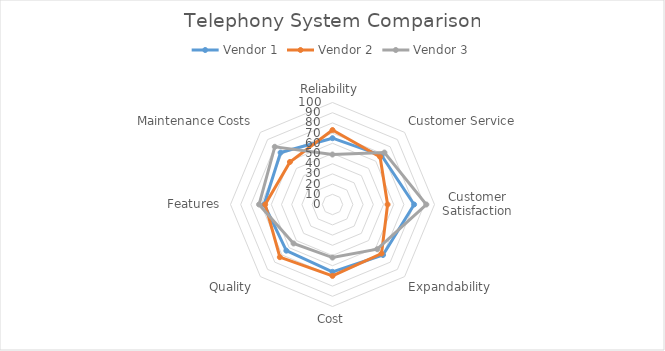
| Category | Vendor 1 | Vendor 2 | Vendor 3 |
|---|---|---|---|
| Reliability | 65 | 73 | 49 |
| Customer Service | 68 | 66 | 72 |
| Customer Satisfaction | 80 | 54 | 92 |
| Expandability | 70 | 68 | 62 |
| Cost | 66 | 70 | 52 |
| Quality | 64 | 73 | 54 |
| Features | 67 | 66 | 72 |
| Maintenance Costs | 72 | 59 | 80 |